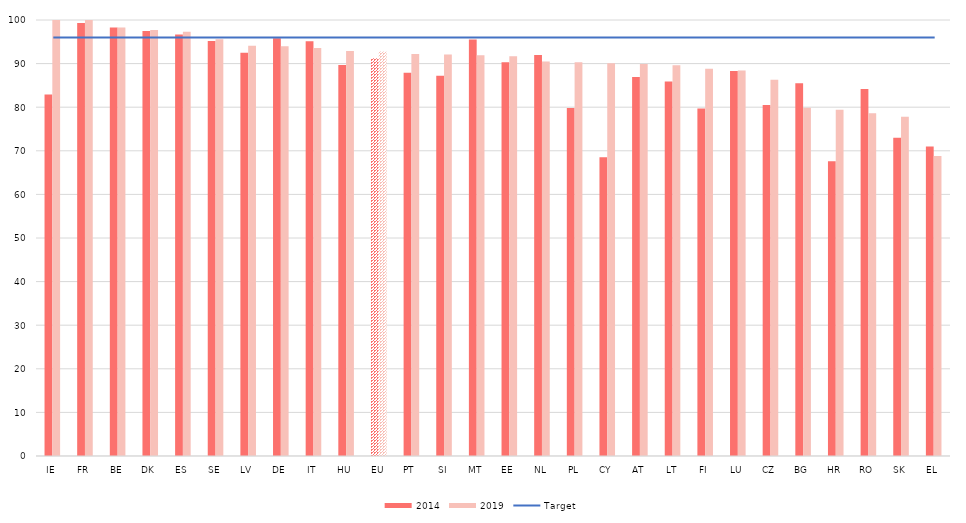
| Category | 2014 | 2019 |
|---|---|---|
| IE | 82.9 | 100 |
| FR | 99.3 | 100 |
| BE | 98.3 | 98.3 |
| DK | 97.5 | 97.7 |
| ES | 96.7 | 97.3 |
| SE | 95.2 | 95.6 |
| LV | 92.5 | 94.1 |
| DE | 95.8 | 94 |
| IT | 95.1 | 93.6 |
| HU | 89.7 | 92.9 |
| EU | 91.2 | 92.8 |
| PT | 87.9 | 92.2 |
| SI | 87.2 | 92.1 |
| MT | 95.5 | 91.9 |
| EE | 90.3 | 91.7 |
| NL | 92 | 90.5 |
| PL | 79.8 | 90.3 |
| CY | 68.5 | 90.1 |
| AT | 86.9 | 89.9 |
| LT | 85.9 | 89.6 |
| FI | 79.7 | 88.8 |
| LU | 88.3 | 88.4 |
| CZ | 80.5 | 86.3 |
| BG | 85.5 | 79.9 |
| HR | 67.6 | 79.4 |
| RO | 84.2 | 78.6 |
| SK | 73 | 77.8 |
| EL | 71 | 68.8 |